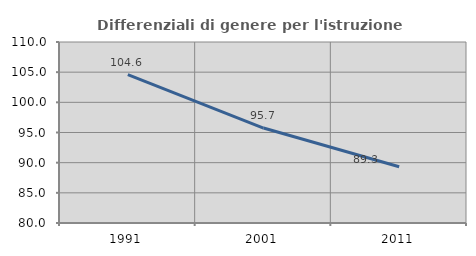
| Category | Differenziali di genere per l'istruzione superiore |
|---|---|
| 1991.0 | 104.584 |
| 2001.0 | 95.741 |
| 2011.0 | 89.333 |